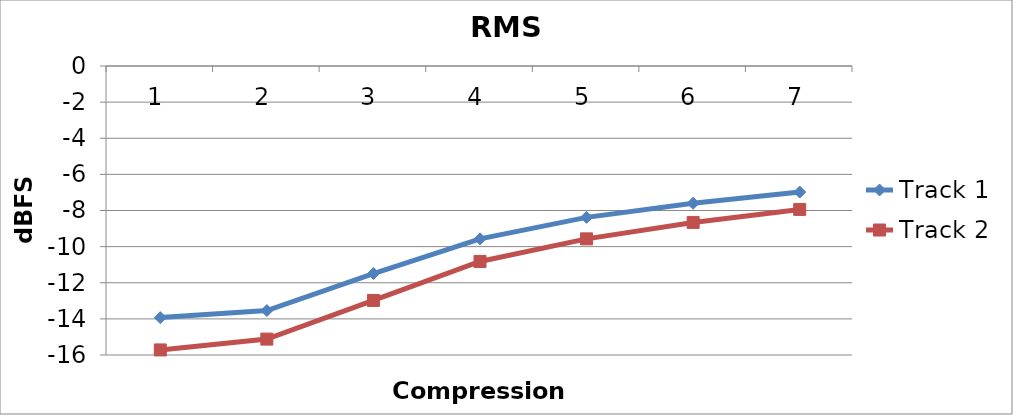
| Category | Track 1 | Track 2 |
|---|---|---|
| 0 | -13.93 | -15.72 |
| 1 | -13.54 | -15.12 |
| 2 | -11.49 | -12.98 |
| 3 | -9.57 | -10.82 |
| 4 | -8.38 | -9.57 |
| 5 | -7.6 | -8.66 |
| 6 | -6.98 | -7.94 |